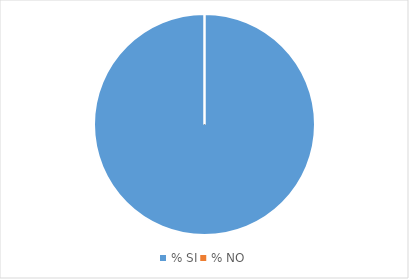
| Category | Series 0 | Series 1 | Series 2 | Series 3 | Series 4 | Series 5 | Series 6 | Series 7 | Series 8 | Series 9 |
|---|---|---|---|---|---|---|---|---|---|---|
| % SI | 6.198 | 6.198 | 3.305 | 11.983 | 14.876 | 15.289 | 14.876 | 5.371 | 10.743 | 6.612 |
| % NO | 0 | 0 | 0 | 0.413 | 1.239 | 0 | 0 | 1.652 | 0 | 1.239 |